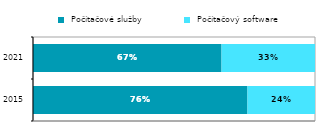
| Category |  Počítačové služby |  Počítačový software |
|---|---|---|
|  2015 | 0.761 | 0.239 |
| 2021 | 0.669 | 0.331 |